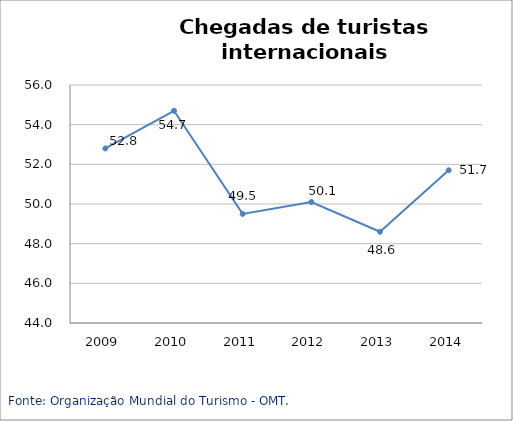
| Category | Oriente Médio |
|---|---|
| 2009.0 | 52.8 |
| 2010.0 | 54.7 |
| 2011.0 | 49.5 |
| 2012.0 | 50.1 |
| 2013.0 | 48.6 |
| 2014.0 | 51.7 |